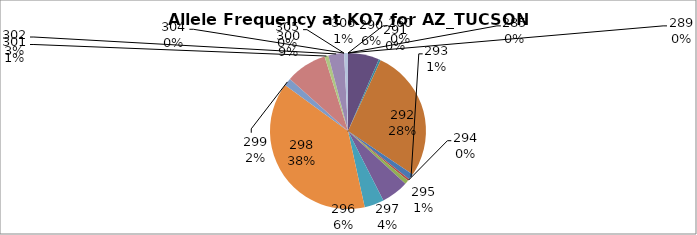
| Category | Series 0 |
|---|---|
| 260.0 | 0 |
| 285.0 | 0 |
| 289.0 | 0 |
| 290.0 | 0.065 |
| 291.0 | 0.004 |
| 292.0 | 0.275 |
| 293.0 | 0.012 |
| 294.0 | 0.004 |
| 295.0 | 0.008 |
| 296.0 | 0.057 |
| 297.0 | 0.04 |
| 298.0 | 0.385 |
| 299.0 | 0.016 |
| 300.0 | 0.085 |
| 301.0 | 0.008 |
| 302.0 | 0.032 |
| 304.0 | 0 |
| 305.0 | 0 |
| 306.0 | 0.008 |